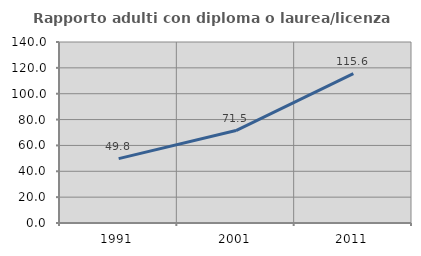
| Category | Rapporto adulti con diploma o laurea/licenza media  |
|---|---|
| 1991.0 | 49.793 |
| 2001.0 | 71.519 |
| 2011.0 | 115.615 |